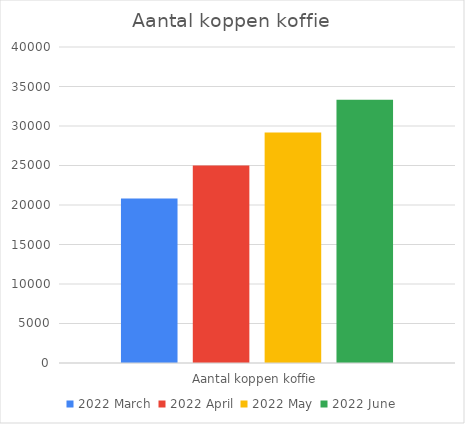
| Category | 2022 maart | 2022 april | 2022 mei | 2022 juni |
|---|---|---|---|---|
| Aantal koppen koffie | 20833.333 | 25000 | 29166.667 | 33333.333 |